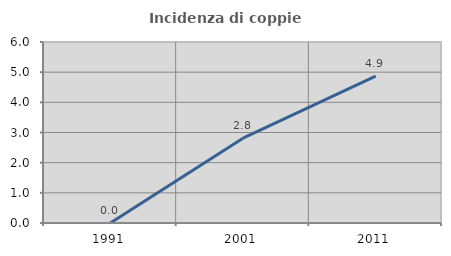
| Category | Incidenza di coppie miste |
|---|---|
| 1991.0 | 0 |
| 2001.0 | 2.811 |
| 2011.0 | 4.867 |